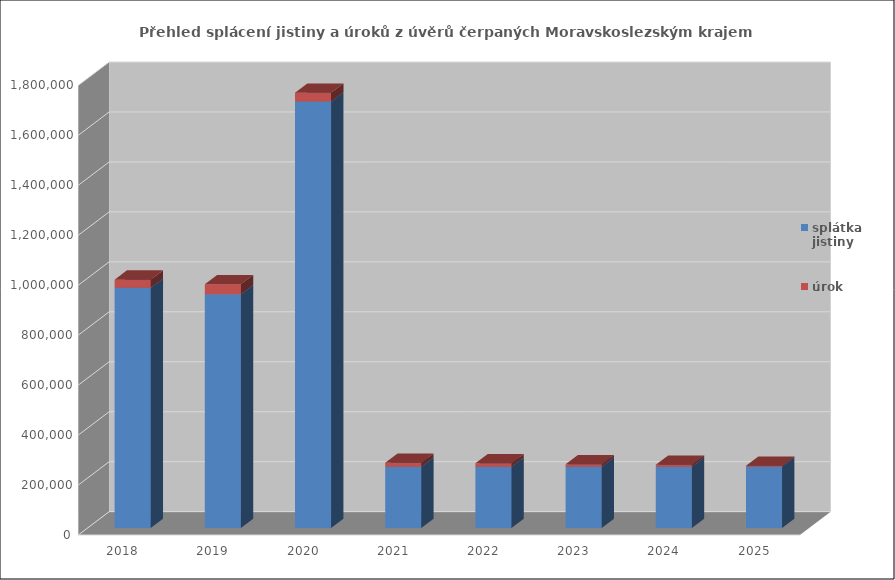
| Category | splátka jistiny | úrok |
|---|---|---|
| 2018.0 | 961912 | 32000 |
| 2019.0 | 935706 | 40000 |
| 2020.0 | 1706944.851 | 35000 |
| 2021.0 | 245000 | 16000 |
| 2022.0 | 245000 | 14000 |
| 2023.0 | 245000 | 10000 |
| 2024.0 | 245000 | 8000 |
| 2025.0 | 245000 | 4000 |